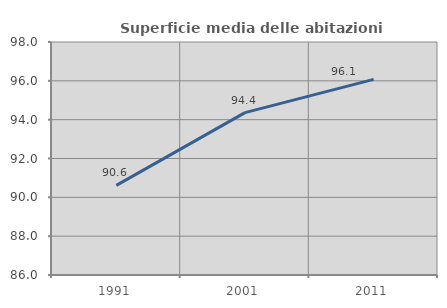
| Category | Superficie media delle abitazioni occupate |
|---|---|
| 1991.0 | 90.617 |
| 2001.0 | 94.36 |
| 2011.0 | 96.075 |